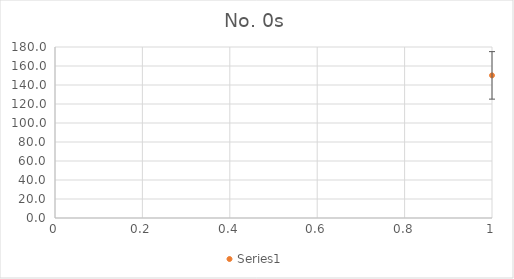
| Category | Series 0 |
|---|---|
| 0 | 150.125 |
| 1 | 156.062 |
| 2 | 139.625 |
| 3 | 160.5 |
| 4 | 168.562 |